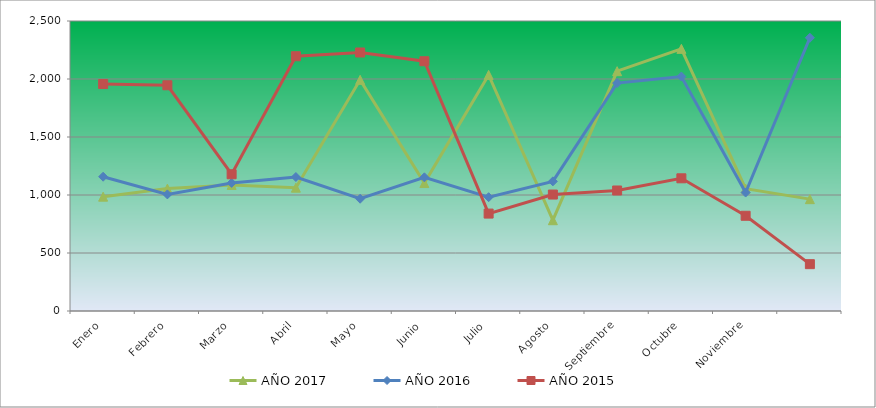
| Category | AÑO 2017 | AÑO 2016 | AÑO 2015 |
|---|---|---|---|
| Enero | 985.651 | 1157.629 | 1956.689 |
| Febrero | 1055.101 | 1005.239 | 1945.923 |
| Marzo | 1087.155 | 1104.159 | 1178.858 |
| Abril | 1063.114 | 1154.956 | 2196.229 |
| Mayo | 1992.672 | 967.81 | 2228.526 |
| Junio | 1103.182 | 1152.282 | 2153.165 |
| Julio | 2035.41 | 981.178 | 839.735 |
| Agosto | 782.645 | 1117.526 | 1003.913 |
| Septiembre | 2067.464 | 1965.029 | 1038.902 |
| Octubre | 2259.786 | 2021.172 | 1143.869 |
| Noviembre | 1055.101 | 1021.28 | 820.894 |